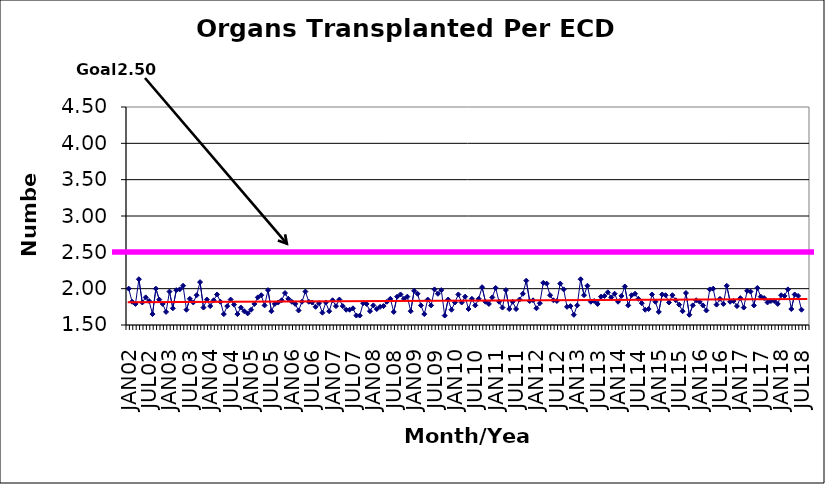
| Category | Series 0 |
|---|---|
| JAN02 | 2 |
| FEB02 | 1.82 |
| MAR02 | 1.79 |
| APR02 | 2.13 |
| MAY02 | 1.81 |
| JUN02 | 1.88 |
| JUL02 | 1.83 |
| AUG02 | 1.65 |
| SEP02 | 2 |
| OCT02 | 1.85 |
| NOV02 | 1.79 |
| DEC02 | 1.68 |
| JAN03 | 1.96 |
| FEB03 | 1.73 |
| MAR03 | 1.98 |
| APR03 | 1.99 |
| MAY03 | 2.04 |
| JUN03 | 1.71 |
| JUL03 | 1.86 |
| AUG03 | 1.81 |
| SEP03 | 1.91 |
| OCT03 | 2.09 |
| NOV03 | 1.74 |
| DEC03 | 1.85 |
| JAN04 | 1.76 |
| FEB04 | 1.84 |
| MAR04 | 1.92 |
| APR04 | 1.82 |
| MAY04 | 1.65 |
| JUN04 | 1.76 |
| JUL04 | 1.85 |
| AUG04 | 1.78 |
| SEP04 | 1.65 |
| OCT04 | 1.74 |
| NOV04 | 1.69 |
| DEC04 | 1.66 |
| JAN05 | 1.71 |
| FEB05 | 1.79 |
| MAR05 | 1.88 |
| APR05 | 1.91 |
| MAY05 | 1.77 |
| JUN05 | 1.98 |
| JUL05 | 1.69 |
| AUG05 | 1.79 |
| SEP05 | 1.81 |
| OCT05 | 1.84 |
| NOV05 | 1.94 |
| DEC05 | 1.86 |
| JAN06 | 1.82 |
| FEB06 | 1.79 |
| MAR06 | 1.7 |
| APR06 | 1.82 |
| MAY06 | 1.96 |
| JUN06 | 1.82 |
| JUL06 | 1.81 |
| AUG06 | 1.75 |
| SEP06 | 1.8 |
| OCT06 | 1.67 |
| NOV06 | 1.81 |
| DEC06 | 1.69 |
| JAN07 | 1.84 |
| FEB07 | 1.76 |
| MAR07 | 1.85 |
| APR07 | 1.76 |
| MAY07 | 1.71 |
| JUN07 | 1.71 |
| JUL07 | 1.73 |
| AUG07 | 1.63 |
| SEP07 | 1.63 |
| OCT07 | 1.8 |
| NOV07 | 1.79 |
| DEC07 | 1.69 |
| JAN08 | 1.77 |
| FEB08 | 1.72 |
| MAR08 | 1.75 |
| APR08 | 1.76 |
| MAY08 | 1.82 |
| JUN08 | 1.86 |
| JUL08 | 1.68 |
| AUG08 | 1.89 |
| SEP08 | 1.92 |
| OCT08 | 1.86 |
| NOV08 | 1.89 |
| DEC08 | 1.69 |
| JAN09 | 1.97 |
| FEB09 | 1.93 |
| MAR09 | 1.77 |
| APR09 | 1.65 |
| MAY09 | 1.85 |
| JUN09 | 1.77 |
| JUL09 | 1.99 |
| AUG09 | 1.93 |
| SEP09 | 1.98 |
| OCT09 | 1.63 |
| NOV09 | 1.85 |
| DEC09 | 1.71 |
| JAN10 | 1.81 |
| FEB10 | 1.92 |
| MAR10 | 1.81 |
| APR10 | 1.89 |
| MAY10 | 1.72 |
| JUN10 | 1.86 |
| JUL10 | 1.77 |
| AUG10 | 1.86 |
| SEP10 | 2.02 |
| OCT10 | 1.82 |
| NOV10 | 1.79 |
| DEC10 | 1.88 |
| JAN11 | 2.01 |
| FEB11 | 1.82 |
| MAR11 | 1.74 |
| APR11 | 1.98 |
| MAY11 | 1.72 |
| JUN11 | 1.82 |
| JUL11 | 1.72 |
| AUG11 | 1.85 |
| SEP11 | 1.93 |
| OCT11 | 2.11 |
| NOV11 | 1.83 |
| DEC11 | 1.84 |
| JAN12 | 1.73 |
| FEB12 | 1.8 |
| MAR12 | 2.08 |
| APR12 | 2.07 |
| MAY12 | 1.91 |
| JUN12 | 1.84 |
| JUL12 | 1.83 |
| AUG12 | 2.07 |
| SEP12 | 1.99 |
| OCT12 | 1.75 |
| NOV12 | 1.76 |
| DEC12 | 1.64 |
| JAN13 | 1.77 |
| FEB13 | 2.13 |
| MAR13 | 1.91 |
| APR13 | 2.04 |
| MAY13 | 1.82 |
| JUN13 | 1.83 |
| JUL13 | 1.79 |
| AUG13 | 1.89 |
| SEP13 | 1.9 |
| OCT13 | 1.95 |
| NOV13 | 1.88 |
| DEC13 | 1.93 |
| JAN14 | 1.82 |
| FEB14 | 1.9 |
| MAR14 | 2.03 |
| APR14 | 1.77 |
| MAY14 | 1.91 |
| JUN14 | 1.93 |
| JUL14 | 1.86 |
| AUG14 | 1.8 |
| SEP14 | 1.71 |
| OCT14 | 1.72 |
| NOV14 | 1.92 |
| DEC14 | 1.82 |
| JAN15 | 1.68 |
| FEB15 | 1.92 |
| MAR15 | 1.91 |
| APR15 | 1.81 |
| MAY15 | 1.91 |
| JUN15 | 1.84 |
| JUL15 | 1.78 |
| AUG15 | 1.69 |
| SEP15 | 1.94 |
| OCT15 | 1.64 |
| NOV15 | 1.77 |
| DEC15 | 1.84 |
| JAN16 | 1.82 |
| FEB16 | 1.77 |
| MAR16 | 1.7 |
| APR16 | 1.99 |
| MAY16 | 2 |
| JUN16 | 1.78 |
| JUL16 | 1.86 |
| AUG16 | 1.79 |
| SEP16 | 2.04 |
| OCT16 | 1.82 |
| NOV16 | 1.83 |
| DEC16 | 1.76 |
| JAN17 | 1.87 |
| FEB17 | 1.74 |
| MAR17 | 1.97 |
| APR17 | 1.96 |
| MAY17 | 1.77 |
| JUN17 | 2.01 |
| JUL17 | 1.89 |
| AUG17 | 1.87 |
| SEP17 | 1.81 |
| OCT17 | 1.83 |
| NOV17 | 1.83 |
| DEC17 | 1.79 |
| JAN18 | 1.91 |
| FEB18 | 1.9 |
| MAR18 | 1.99 |
| APR18 | 1.72 |
| MAY18 | 1.92 |
| JUN18 | 1.9 |
| JUL18 | 1.71 |